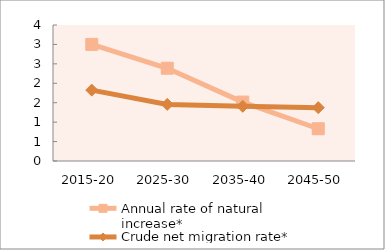
| Category | Annual rate of natural increase* | Crude net migration rate* |
|---|---|---|
| 2015-20 | 3.001 | 1.824 |
| 2025-30 | 2.387 | 1.457 |
| 2035-40 | 1.516 | 1.408 |
| 2045-50 | 0.83 | 1.373 |